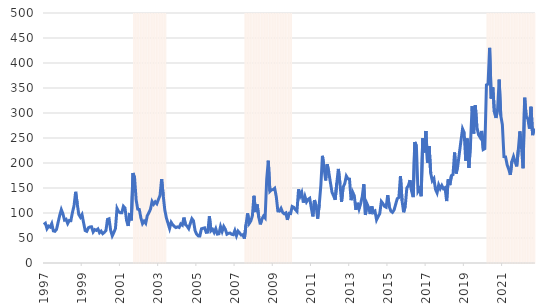
| Category | Panel |
|---|---|
| 1997-01-01 | 0 |
| 1997-02-01 | 0 |
| 1997-03-01 | 0 |
| 1997-04-01 | 0 |
| 1997-05-01 | 0 |
| 1997-06-01 | 0 |
| 1997-07-01 | 0 |
| 1997-08-01 | 0 |
| 1997-09-01 | 0 |
| 1997-10-01 | 0 |
| 1997-11-01 | 0 |
| 1997-12-01 | 0 |
| 1998-01-01 | 0 |
| 1998-02-01 | 0 |
| 1998-03-01 | 0 |
| 1998-04-01 | 0 |
| 1998-05-01 | 0 |
| 1998-06-01 | 0 |
| 1998-07-01 | 0 |
| 1998-08-01 | 0 |
| 1998-09-01 | 0 |
| 1998-10-01 | 0 |
| 1998-11-01 | 0 |
| 1998-12-01 | 0 |
| 1999-01-01 | 0 |
| 1999-02-01 | 0 |
| 1999-03-01 | 0 |
| 1999-04-01 | 0 |
| 1999-05-01 | 0 |
| 1999-06-01 | 0 |
| 1999-07-01 | 0 |
| 1999-08-01 | 0 |
| 1999-09-01 | 0 |
| 1999-10-01 | 0 |
| 1999-11-01 | 0 |
| 1999-12-01 | 0 |
| 2000-01-01 | 0 |
| 2000-02-01 | 0 |
| 2000-03-01 | 0 |
| 2000-04-01 | 0 |
| 2000-05-01 | 0 |
| 2000-06-01 | 0 |
| 2000-07-01 | 0 |
| 2000-08-01 | 0 |
| 2000-09-01 | 0 |
| 2000-10-01 | 0 |
| 2000-11-01 | 0 |
| 2000-12-01 | 0 |
| 2001-01-01 | 0 |
| 2001-02-01 | 0 |
| 2001-03-01 | 0 |
| 2001-04-01 | 0 |
| 2001-05-01 | 0 |
| 2001-06-01 | 0 |
| 2001-07-01 | 0 |
| 2001-08-01 | 0 |
| 2001-09-01 | 500 |
| 2001-10-01 | 500 |
| 2001-11-01 | 500 |
| 2001-12-01 | 500 |
| 2002-01-01 | 500 |
| 2002-02-01 | 500 |
| 2002-03-01 | 500 |
| 2002-04-01 | 500 |
| 2002-05-01 | 500 |
| 2002-06-01 | 500 |
| 2002-07-01 | 500 |
| 2002-08-01 | 500 |
| 2002-09-01 | 500 |
| 2002-10-01 | 500 |
| 2002-11-01 | 500 |
| 2002-12-01 | 500 |
| 2003-01-01 | 500 |
| 2003-02-01 | 500 |
| 2003-03-01 | 500 |
| 2003-04-01 | 500 |
| 2003-05-01 | 500 |
| 2003-06-01 | 0 |
| 2003-07-01 | 0 |
| 2003-08-01 | 0 |
| 2003-09-01 | 0 |
| 2003-10-01 | 0 |
| 2003-11-01 | 0 |
| 2003-12-01 | 0 |
| 2004-01-01 | 0 |
| 2004-02-01 | 0 |
| 2004-03-01 | 0 |
| 2004-04-01 | 0 |
| 2004-05-01 | 0 |
| 2004-06-01 | 0 |
| 2004-07-01 | 0 |
| 2004-08-01 | 0 |
| 2004-09-01 | 0 |
| 2004-10-01 | 0 |
| 2004-11-01 | 0 |
| 2004-12-01 | 0 |
| 2005-01-01 | 0 |
| 2005-02-01 | 0 |
| 2005-03-01 | 0 |
| 2005-04-01 | 0 |
| 2005-05-01 | 0 |
| 2005-06-01 | 0 |
| 2005-07-01 | 0 |
| 2005-08-01 | 0 |
| 2005-09-01 | 0 |
| 2005-10-01 | 0 |
| 2005-11-01 | 0 |
| 2005-12-01 | 0 |
| 2006-01-01 | 0 |
| 2006-02-01 | 0 |
| 2006-03-01 | 0 |
| 2006-04-01 | 0 |
| 2006-05-01 | 0 |
| 2006-06-01 | 0 |
| 2006-07-01 | 0 |
| 2006-08-01 | 0 |
| 2006-09-01 | 0 |
| 2006-10-01 | 0 |
| 2006-11-01 | 0 |
| 2006-12-01 | 0 |
| 2007-01-01 | 0 |
| 2007-02-01 | 0 |
| 2007-03-01 | 0 |
| 2007-04-01 | 0 |
| 2007-05-01 | 0 |
| 2007-06-01 | 0 |
| 2007-07-01 | 500 |
| 2007-08-01 | 500 |
| 2007-09-01 | 500 |
| 2007-10-01 | 500 |
| 2007-11-01 | 500 |
| 2007-12-01 | 500 |
| 2008-01-01 | 500 |
| 2008-02-01 | 500 |
| 2008-03-01 | 500 |
| 2008-04-01 | 500 |
| 2008-05-01 | 500 |
| 2008-06-01 | 500 |
| 2008-07-01 | 500 |
| 2008-08-01 | 500 |
| 2008-09-01 | 500 |
| 2008-10-01 | 500 |
| 2008-11-01 | 500 |
| 2008-12-01 | 500 |
| 2009-01-01 | 500 |
| 2009-02-01 | 500 |
| 2009-03-01 | 500 |
| 2009-04-01 | 500 |
| 2009-05-01 | 500 |
| 2009-06-01 | 500 |
| 2009-07-01 | 500 |
| 2009-08-01 | 500 |
| 2009-09-01 | 500 |
| 2009-10-01 | 500 |
| 2009-11-01 | 500 |
| 2009-12-01 | 500 |
| 2010-01-01 | 0 |
| 2010-02-01 | 0 |
| 2010-03-01 | 0 |
| 2010-04-01 | 0 |
| 2010-05-01 | 0 |
| 2010-06-01 | 0 |
| 2010-07-01 | 0 |
| 2010-08-01 | 0 |
| 2010-09-01 | 0 |
| 2010-10-01 | 0 |
| 2010-11-01 | 0 |
| 2010-12-01 | 0 |
| 2011-01-01 | 0 |
| 2011-02-01 | 0 |
| 2011-03-01 | 0 |
| 2011-04-01 | 0 |
| 2011-05-01 | 0 |
| 2011-06-01 | 0 |
| 2011-07-01 | 0 |
| 2011-08-01 | 0 |
| 2011-09-01 | 0 |
| 2011-10-01 | 0 |
| 2011-11-01 | 0 |
| 2011-12-01 | 0 |
| 2012-01-01 | 0 |
| 2012-02-01 | 0 |
| 2012-03-01 | 0 |
| 2012-04-01 | 0 |
| 2012-05-01 | 0 |
| 2012-06-01 | 0 |
| 2012-07-01 | 0 |
| 2012-08-01 | 0 |
| 2012-09-01 | 0 |
| 2012-10-01 | 0 |
| 2012-11-01 | 0 |
| 2012-12-01 | 0 |
| 2013-01-01 | 0 |
| 2013-02-01 | 0 |
| 2013-03-01 | 0 |
| 2013-04-01 | 0 |
| 2013-05-01 | 0 |
| 2013-06-01 | 0 |
| 2013-07-01 | 0 |
| 2013-08-01 | 0 |
| 2013-09-01 | 0 |
| 2013-10-01 | 0 |
| 2013-11-01 | 0 |
| 2013-12-01 | 0 |
| 2014-01-01 | 0 |
| 2014-02-01 | 0 |
| 2014-03-01 | 0 |
| 2014-04-01 | 0 |
| 2014-05-01 | 0 |
| 2014-06-01 | 0 |
| 2014-07-01 | 0 |
| 2014-08-01 | 0 |
| 2014-09-01 | 0 |
| 2014-10-01 | 0 |
| 2014-11-01 | 0 |
| 2014-12-01 | 0 |
| 2015-01-01 | 0 |
| 2015-02-01 | 0 |
| 2015-03-01 | 0 |
| 2015-04-01 | 0 |
| 2015-05-01 | 0 |
| 2015-06-01 | 0 |
| 2015-07-01 | 0 |
| 2015-08-01 | 0 |
| 2015-09-01 | 0 |
| 2015-10-01 | 0 |
| 2015-11-01 | 0 |
| 2015-12-01 | 0 |
| 2016-01-01 | 0 |
| 2016-02-01 | 0 |
| 2016-03-01 | 0 |
| 2016-04-01 | 0 |
| 2016-05-01 | 0 |
| 2016-06-01 | 0 |
| 2016-07-01 | 0 |
| 2016-08-01 | 0 |
| 2016-09-01 | 0 |
| 2016-10-01 | 0 |
| 2016-11-01 | 0 |
| 2016-12-01 | 0 |
| 2017-01-01 | 0 |
| 2017-02-01 | 0 |
| 2017-03-01 | 0 |
| 2017-04-01 | 0 |
| 2017-05-01 | 0 |
| 2017-06-01 | 0 |
| 2017-07-01 | 0 |
| 2017-08-01 | 0 |
| 2017-09-01 | 0 |
| 2017-10-01 | 0 |
| 2017-11-01 | 0 |
| 2017-12-01 | 0 |
| 2018-01-01 | 0 |
| 2018-02-01 | 0 |
| 2018-03-01 | 0 |
| 2018-04-01 | 0 |
| 2018-05-01 | 0 |
| 2018-06-01 | 0 |
| 2018-07-01 | 0 |
| 2018-08-01 | 0 |
| 2018-09-01 | 0 |
| 2018-10-01 | 0 |
| 2018-11-01 | 0 |
| 2018-12-01 | 0 |
| 2019-01-01 | 0 |
| 2019-02-01 | 0 |
| 2019-03-01 | 0 |
| 2019-04-01 | 0 |
| 2019-05-01 | 0 |
| 2019-06-01 | 0 |
| 2019-07-01 | 0 |
| 2019-08-01 | 0 |
| 2019-09-01 | 0 |
| 2019-10-01 | 0 |
| 2019-11-01 | 0 |
| 2019-12-01 | 0 |
| 2020-01-01 | 0 |
| 2020-02-01 | 0 |
| 2020-03-01 | 500 |
| 2020-04-01 | 500 |
| 2020-05-01 | 500 |
| 2020-06-01 | 500 |
| 2020-07-01 | 500 |
| 2020-08-01 | 500 |
| 2020-09-01 | 500 |
| 2020-10-01 | 500 |
| 2020-11-01 | 500 |
| 2020-12-01 | 500 |
| 2021-01-01 | 500 |
| 2021-02-01 | 500 |
| 2021-03-01 | 500 |
| 2021-04-01 | 500 |
| 2021-05-01 | 500 |
| 2021-06-01 | 500 |
| 2021-07-01 | 500 |
| 2021-08-01 | 500 |
| 2021-09-01 | 500 |
| 2021-10-01 | 500 |
| 2021-11-01 | 500 |
| 2021-12-01 | 500 |
| 2022-01-01 | 500 |
| 2022-02-01 | 500 |
| 2022-03-01 | 500 |
| 2022-04-01 | 500 |
| 2022-05-01 | 500 |
| 2022-06-01 | 500 |
| 2022-07-01 | 500 |
| 2022-08-01 | 500 |
| 2022-09-01 | 500 |